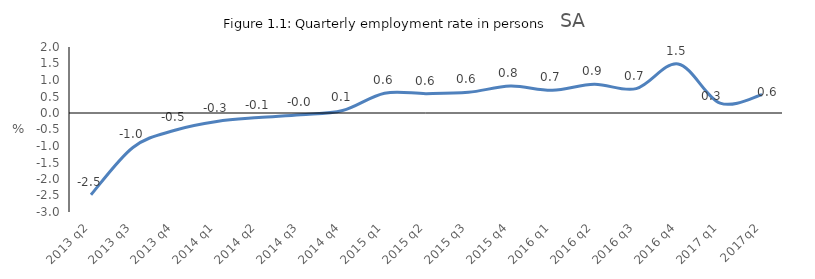
| Category | Series 0 |
|---|---|
| 2013 q2 | -2.479 |
| 2013 q3 | -1.044 |
| 2013 q4 | -0.522 |
| 2014 q1 | -0.255 |
| 2014 q2 | -0.138 |
| 2014 q3 | -0.05 |
| 2014 q4 | 0.077 |
| 2015 q1 | 0.6 |
| 2015 q2 | 0.587 |
| 2015 q3 | 0.627 |
| 2015 q4 | 0.815 |
| 2016 q1 | 0.69 |
| 2016 q2 | 0.872 |
| 2016 q3 | 0.738 |
| 2016 q4 | 1.486 |
| 2017 q1 | 0.3 |
| 2017q2 | 0.552 |